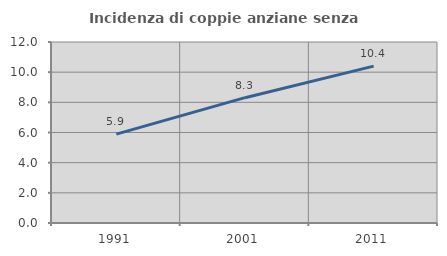
| Category | Incidenza di coppie anziane senza figli  |
|---|---|
| 1991.0 | 5.891 |
| 2001.0 | 8.309 |
| 2011.0 | 10.4 |